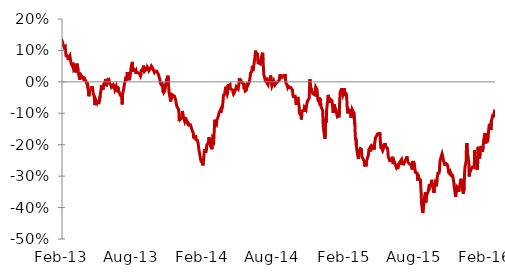
| Category | Series 0 |
|---|---|
| 2010-01-04 | 0.467 |
| 2010-01-05 | 0.465 |
| 2010-01-06 | 0.443 |
| 2010-01-07 | 0.453 |
| 2010-01-08 | 0.454 |
| 2010-01-12 | 0.45 |
| 2010-01-13 | 0.459 |
| 2010-01-14 | 0.483 |
| 2010-01-15 | 0.493 |
| 2010-01-18 | 0.49 |
| 2010-01-19 | 0.49 |
| 2010-01-20 | 0.501 |
| 2010-01-21 | 0.487 |
| 2010-01-22 | 0.493 |
| 2010-01-25 | 0.478 |
| 2010-01-26 | 0.474 |
| 2010-01-27 | 0.467 |
| 2010-01-28 | 0.447 |
| 2010-01-29 | 0.458 |
| 2010-02-01 | 0.446 |
| 2010-02-02 | 0.459 |
| 2010-02-03 | 0.451 |
| 2010-02-04 | 0.427 |
| 2010-02-05 | 0.419 |
| 2010-02-08 | 0.406 |
| 2010-02-09 | 0.417 |
| 2010-02-10 | 0.431 |
| 2010-02-11 | 0.441 |
| 2010-02-12 | 0.449 |
| 2010-02-15 | 0.434 |
| 2010-02-16 | 0.444 |
| 2010-02-17 | 0.466 |
| 2010-02-18 | 0.472 |
| 2010-02-19 | 0.48 |
| 2010-02-22 | 0.498 |
| 2010-02-23 | 0.507 |
| 2010-02-24 | 0.528 |
| 2010-02-25 | 0.509 |
| 2010-02-26 | 0.498 |
| 2010-03-01 | 0.491 |
| 2010-03-02 | 0.514 |
| 2010-03-03 | 0.516 |
| 2010-03-04 | 0.501 |
| 2010-03-05 | 0.515 |
| 2010-03-08 | 0.518 |
| 2010-03-09 | 0.516 |
| 2010-03-10 | 0.502 |
| 2010-03-11 | 0.51 |
| 2010-03-12 | 0.504 |
| 2010-03-15 | 0.498 |
| 2010-03-16 | 0.495 |
| 2010-03-17 | 0.51 |
| 2010-03-18 | 0.509 |
| 2010-03-19 | 0.486 |
| 2010-03-23 | 0.5 |
| 2010-03-24 | 0.484 |
| 2010-03-25 | 0.488 |
| 2010-03-26 | 0.487 |
| 2010-03-29 | 0.493 |
| 2010-03-30 | 0.507 |
| 2010-03-31 | 0.499 |
| 2010-04-05 | 0.502 |
| 2010-04-06 | 0.494 |
| 2010-04-07 | 0.506 |
| 2010-04-08 | 0.508 |
| 2010-04-09 | 0.504 |
| 2010-04-12 | 0.51 |
| 2010-04-13 | 0.514 |
| 2010-04-14 | 0.514 |
| 2010-04-15 | 0.511 |
| 2010-04-16 | 0.498 |
| 2010-04-19 | 0.496 |
| 2010-04-20 | 0.513 |
| 2010-04-21 | 0.516 |
| 2010-04-22 | 0.517 |
| 2010-04-23 | 0.513 |
| 2010-04-26 | 0.484 |
| 2010-04-27 | 0.478 |
| 2010-04-28 | 0.462 |
| 2010-04-29 | 0.453 |
| 2010-04-30 | 0.454 |
| 2010-05-03 | 0.452 |
| 2010-05-04 | 0.441 |
| 2010-05-05 | 0.409 |
| 2010-05-06 | 0.366 |
| 2010-05-07 | 0.341 |
| 2010-05-10 | 0.367 |
| 2010-05-11 | 0.363 |
| 2010-05-12 | 0.383 |
| 2010-05-13 | 0.374 |
| 2010-05-14 | 0.366 |
| 2010-05-18 | 0.342 |
| 2010-05-19 | 0.319 |
| 2010-05-20 | 0.309 |
| 2010-05-21 | 0.327 |
| 2010-05-24 | 0.336 |
| 2010-05-25 | 0.32 |
| 2010-05-26 | 0.347 |
| 2010-05-27 | 0.333 |
| 2010-05-28 | 0.338 |
| 2010-05-31 | 0.315 |
| 2010-06-01 | 0.321 |
| 2010-06-02 | 0.331 |
| 2010-06-03 | 0.323 |
| 2010-06-04 | 0.312 |
| 2010-06-08 | 0.312 |
| 2010-06-09 | 0.318 |
| 2010-06-10 | 0.314 |
| 2010-06-11 | 0.298 |
| 2010-06-15 | 0.298 |
| 2010-06-16 | 0.315 |
| 2010-06-17 | 0.309 |
| 2010-06-18 | 0.311 |
| 2010-06-21 | 0.296 |
| 2010-06-22 | 0.298 |
| 2010-06-23 | 0.3 |
| 2010-06-24 | 0.29 |
| 2010-06-25 | 0.298 |
| 2010-06-28 | 0.289 |
| 2010-06-29 | 0.261 |
| 2010-06-30 | 0.27 |
| 2010-07-01 | 0.267 |
| 2010-07-02 | 0.27 |
| 2010-07-06 | 0.273 |
| 2010-07-07 | 0.281 |
| 2010-07-08 | 0.306 |
| 2010-07-09 | 0.311 |
| 2010-07-12 | 0.324 |
| 2010-07-13 | 0.325 |
| 2010-07-14 | 0.333 |
| 2010-07-15 | 0.338 |
| 2010-07-16 | 0.323 |
| 2010-07-19 | 0.317 |
| 2010-07-21 | 0.335 |
| 2010-07-22 | 0.316 |
| 2010-07-23 | 0.314 |
| 2010-07-26 | 0.334 |
| 2010-07-27 | 0.352 |
| 2010-07-28 | 0.349 |
| 2010-07-29 | 0.308 |
| 2010-07-30 | 0.307 |
| 2010-08-02 | 0.301 |
| 2010-08-03 | 0.306 |
| 2010-08-04 | 0.316 |
| 2010-08-05 | 0.314 |
| 2010-08-06 | 0.297 |
| 2010-08-09 | 0.308 |
| 2010-08-10 | 0.298 |
| 2010-08-11 | 0.278 |
| 2010-08-12 | 0.277 |
| 2010-08-13 | 0.287 |
| 2010-08-17 | 0.288 |
| 2010-08-18 | 0.282 |
| 2010-08-19 | 0.277 |
| 2010-08-20 | 0.254 |
| 2010-08-23 | 0.27 |
| 2010-08-24 | 0.276 |
| 2010-08-25 | 0.281 |
| 2010-08-26 | 0.286 |
| 2010-08-27 | 0.305 |
| 2010-08-30 | 0.332 |
| 2010-08-31 | 0.341 |
| 2010-09-01 | 0.379 |
| 2010-09-02 | 0.343 |
| 2010-09-03 | 0.341 |
| 2010-09-06 | 0.344 |
| 2010-09-07 | 0.341 |
| 2010-09-08 | 0.354 |
| 2010-09-09 | 0.352 |
| 2010-09-10 | 0.338 |
| 2010-09-13 | 0.309 |
| 2010-09-14 | 0.31 |
| 2010-09-15 | 0.307 |
| 2010-09-16 | 0.287 |
| 2010-09-17 | 0.289 |
| 2010-09-20 | 0.292 |
| 2010-09-21 | 0.287 |
| 2010-09-22 | 0.28 |
| 2010-09-23 | 0.26 |
| 2010-09-24 | 0.242 |
| 2010-09-27 | 0.259 |
| 2010-09-28 | 0.272 |
| 2010-09-29 | 0.295 |
| 2010-09-30 | 0.294 |
| 2010-10-01 | 0.28 |
| 2010-10-04 | 0.264 |
| 2010-10-05 | 0.281 |
| 2010-10-06 | 0.304 |
| 2010-10-07 | 0.305 |
| 2010-10-08 | 0.338 |
| 2010-10-11 | 0.355 |
| 2010-10-12 | 0.353 |
| 2010-10-13 | 0.364 |
| 2010-10-14 | 0.332 |
| 2010-10-15 | 0.332 |
| 2010-10-19 | 0.344 |
| 2010-10-20 | 0.352 |
| 2010-10-21 | 0.365 |
| 2010-10-22 | 0.392 |
| 2010-10-25 | 0.397 |
| 2010-10-26 | 0.38 |
| 2010-10-27 | 0.367 |
| 2010-10-28 | 0.398 |
| 2010-10-29 | 0.427 |
| 2010-11-02 | 0.416 |
| 2010-11-03 | 0.407 |
| 2010-11-04 | 0.417 |
| 2010-11-05 | 0.398 |
| 2010-11-08 | 0.397 |
| 2010-11-09 | 0.397 |
| 2010-11-10 | 0.368 |
| 2010-11-11 | 0.34 |
| 2010-11-12 | 0.311 |
| 2010-11-16 | 0.286 |
| 2010-11-17 | 0.317 |
| 2010-11-18 | 0.332 |
| 2010-11-19 | 0.309 |
| 2010-11-22 | 0.302 |
| 2010-11-23 | 0.277 |
| 2010-11-24 | 0.308 |
| 2010-11-25 | 0.295 |
| 2010-11-26 | 0.295 |
| 2010-11-29 | 0.277 |
| 2010-11-30 | 0.286 |
| 2010-12-01 | 0.279 |
| 2010-12-02 | 0.299 |
| 2010-12-03 | 0.298 |
| 2010-12-06 | 0.304 |
| 2010-12-07 | 0.307 |
| 2010-12-09 | 0.29 |
| 2010-12-10 | 0.293 |
| 2010-12-13 | 0.297 |
| 2010-12-14 | 0.291 |
| 2010-12-15 | 0.277 |
| 2010-12-16 | 0.287 |
| 2010-12-17 | 0.286 |
| 2010-12-20 | 0.285 |
| 2010-12-21 | 0.291 |
| 2010-12-22 | 0.293 |
| 2010-12-23 | 0.302 |
| 2010-12-24 | 0.305 |
| 2010-12-27 | 0.311 |
| 2010-12-28 | 0.297 |
| 2010-12-29 | 0.288 |
| 2010-12-30 | 0.283 |
| 2011-01-03 | 0.275 |
| 2011-01-04 | 0.275 |
| 2011-01-05 | 0.268 |
| 2011-01-06 | 0.247 |
| 2011-01-07 | 0.25 |
| 2011-01-11 | 0.243 |
| 2011-01-12 | 0.255 |
| 2011-01-13 | 0.262 |
| 2011-01-14 | 0.262 |
| 2011-01-17 | 0.285 |
| 2011-01-18 | 0.273 |
| 2011-01-19 | 0.272 |
| 2011-01-20 | 0.249 |
| 2011-01-21 | 0.259 |
| 2011-01-24 | 0.263 |
| 2011-01-25 | 0.252 |
| 2011-01-26 | 0.265 |
| 2011-01-27 | 0.262 |
| 2011-01-28 | 0.263 |
| 2011-01-31 | 0.278 |
| 2011-02-01 | 0.283 |
| 2011-02-02 | 0.274 |
| 2011-02-03 | 0.255 |
| 2011-02-04 | 0.233 |
| 2011-02-07 | 0.22 |
| 2011-02-08 | 0.232 |
| 2011-02-09 | 0.223 |
| 2011-02-10 | 0.213 |
| 2011-02-11 | 0.215 |
| 2011-02-14 | 0.225 |
| 2011-02-15 | 0.21 |
| 2011-02-16 | 0.208 |
| 2011-02-17 | 0.189 |
| 2011-02-18 | 0.162 |
| 2011-02-21 | 0.179 |
| 2011-02-22 | 0.178 |
| 2011-02-23 | 0.198 |
| 2011-02-24 | 0.2 |
| 2011-02-25 | 0.201 |
| 2011-02-28 | 0.225 |
| 2011-03-01 | 0.23 |
| 2011-03-02 | 0.223 |
| 2011-03-03 | 0.239 |
| 2011-03-04 | 0.242 |
| 2011-03-07 | 0.236 |
| 2011-03-08 | 0.223 |
| 2011-03-09 | 0.229 |
| 2011-03-10 | 0.202 |
| 2011-03-11 | 0.173 |
| 2011-03-14 | 0.163 |
| 2011-03-15 | 0.152 |
| 2011-03-16 | 0.138 |
| 2011-03-17 | 0.183 |
| 2011-03-18 | 0.198 |
| 2011-03-22 | 0.202 |
| 2011-03-23 | 0.198 |
| 2011-03-24 | 0.197 |
| 2011-03-25 | 0.182 |
| 2011-03-28 | 0.171 |
| 2011-03-29 | 0.157 |
| 2011-03-30 | 0.146 |
| 2011-03-31 | 0.154 |
| 2011-04-01 | 0.151 |
| 2011-04-04 | 0.15 |
| 2011-04-05 | 0.158 |
| 2011-04-06 | 0.151 |
| 2011-04-07 | 0.152 |
| 2011-04-08 | 0.155 |
| 2011-04-11 | 0.159 |
| 2011-04-12 | 0.133 |
| 2011-04-13 | 0.132 |
| 2011-04-14 | 0.122 |
| 2011-04-15 | 0.115 |
| 2011-04-18 | 0.108 |
| 2011-04-19 | 0.121 |
| 2011-04-20 | 0.149 |
| 2011-04-25 | 0.139 |
| 2011-04-26 | 0.146 |
| 2011-04-27 | 0.126 |
| 2011-04-28 | 0.136 |
| 2011-04-29 | 0.162 |
| 2011-05-02 | 0.187 |
| 2011-05-03 | 0.168 |
| 2011-05-04 | 0.153 |
| 2011-05-05 | 0.13 |
| 2011-05-06 | 0.13 |
| 2011-05-09 | 0.138 |
| 2011-05-10 | 0.159 |
| 2011-05-11 | 0.175 |
| 2011-05-12 | 0.191 |
| 2011-05-13 | 0.201 |
| 2011-05-16 | 0.196 |
| 2011-05-17 | 0.194 |
| 2011-05-18 | 0.201 |
| 2011-05-19 | 0.175 |
| 2011-05-20 | 0.18 |
| 2011-05-23 | 0.167 |
| 2011-05-24 | 0.175 |
| 2011-05-25 | 0.171 |
| 2011-05-26 | 0.177 |
| 2011-05-27 | 0.175 |
| 2011-05-30 | 0.189 |
| 2011-05-31 | 0.206 |
| 2011-06-01 | 0.193 |
| 2011-06-02 | 0.192 |
| 2011-06-03 | 0.191 |
| 2011-06-07 | 0.188 |
| 2011-06-08 | 0.184 |
| 2011-06-09 | 0.183 |
| 2011-06-10 | 0.174 |
| 2011-06-13 | 0.165 |
| 2011-06-14 | 0.164 |
| 2011-06-15 | 0.145 |
| 2011-06-16 | 0.147 |
| 2011-06-17 | 0.143 |
| 2011-06-20 | 0.142 |
| 2011-06-21 | 0.162 |
| 2011-06-22 | 0.16 |
| 2011-06-23 | 0.16 |
| 2011-06-24 | 0.162 |
| 2011-06-28 | 0.156 |
| 2011-06-29 | 0.162 |
| 2011-06-30 | 0.143 |
| 2011-07-01 | 0.144 |
| 2011-07-05 | 0.137 |
| 2011-07-06 | 0.107 |
| 2011-07-07 | 0.096 |
| 2011-07-08 | 0.078 |
| 2011-07-11 | 0.055 |
| 2011-07-12 | 0.044 |
| 2011-07-13 | 0.029 |
| 2011-07-14 | 0.012 |
| 2011-07-15 | 0.009 |
| 2011-07-18 | -0.005 |
| 2011-07-19 | 0.016 |
| 2011-07-21 | 0.035 |
| 2011-07-22 | 0.052 |
| 2011-07-25 | 0.052 |
| 2011-07-26 | 0.055 |
| 2011-07-27 | 0.041 |
| 2011-07-28 | 0.046 |
| 2011-07-29 | 0.036 |
| 2011-08-01 | 0.055 |
| 2011-08-02 | 0.047 |
| 2011-08-03 | 0.046 |
| 2011-08-04 | 0.027 |
| 2011-08-05 | 0.02 |
| 2011-08-08 | -0.021 |
| 2011-08-09 | 0.002 |
| 2011-08-10 | 0 |
| 2011-08-11 | 0.009 |
| 2011-08-12 | 0.016 |
| 2011-08-16 | 0.009 |
| 2011-08-17 | 0.011 |
| 2011-08-18 | -0.014 |
| 2011-08-19 | -0.027 |
| 2011-08-22 | -0.04 |
| 2011-08-23 | -0.023 |
| 2011-08-24 | -0.033 |
| 2011-08-25 | -0.07 |
| 2011-08-26 | -0.047 |
| 2011-08-29 | -0.032 |
| 2011-08-30 | -0.047 |
| 2011-08-31 | -0.043 |
| 2011-09-01 | -0.055 |
| 2011-09-02 | -0.052 |
| 2011-09-05 | -0.054 |
| 2011-09-06 | -0.037 |
| 2011-09-07 | -0.034 |
| 2011-09-08 | -0.029 |
| 2011-09-09 | -0.036 |
| 2011-09-12 | -0.037 |
| 2011-09-13 | -0.045 |
| 2011-09-14 | -0.045 |
| 2011-09-15 | -0.029 |
| 2011-09-16 | -0.005 |
| 2011-09-19 | -0.01 |
| 2011-09-20 | -0.021 |
| 2011-09-21 | -0.052 |
| 2011-09-22 | -0.094 |
| 2011-09-23 | -0.105 |
| 2011-09-26 | -0.109 |
| 2011-09-27 | -0.103 |
| 2011-09-28 | -0.123 |
| 2011-09-29 | -0.13 |
| 2011-09-30 | -0.132 |
| 2011-10-03 | -0.163 |
| 2011-10-04 | -0.163 |
| 2011-10-05 | -0.155 |
| 2011-10-06 | -0.164 |
| 2011-10-07 | -0.158 |
| 2011-10-10 | -0.135 |
| 2011-10-11 | -0.151 |
| 2011-10-12 | -0.144 |
| 2011-10-13 | -0.153 |
| 2011-10-14 | -0.164 |
| 2011-10-18 | -0.155 |
| 2011-10-19 | -0.147 |
| 2011-10-20 | -0.14 |
| 2011-10-21 | -0.14 |
| 2011-10-24 | -0.152 |
| 2011-10-25 | -0.166 |
| 2011-10-26 | -0.17 |
| 2011-10-27 | -0.169 |
| 2011-10-28 | -0.17 |
| 2011-10-31 | -0.179 |
| 2011-11-01 | -0.194 |
| 2011-11-02 | -0.169 |
| 2011-11-03 | -0.135 |
| 2011-11-04 | -0.115 |
| 2011-11-08 | -0.073 |
| 2011-11-09 | -0.122 |
| 2011-11-10 | -0.142 |
| 2011-11-11 | -0.117 |
| 2011-11-15 | -0.117 |
| 2011-11-16 | -0.107 |
| 2011-11-17 | -0.131 |
| 2011-11-18 | -0.133 |
| 2011-11-21 | -0.136 |
| 2011-11-22 | -0.137 |
| 2011-11-23 | -0.173 |
| 2011-11-24 | -0.184 |
| 2011-11-25 | -0.208 |
| 2011-11-28 | -0.19 |
| 2011-11-29 | -0.188 |
| 2011-11-30 | -0.163 |
| 2011-12-01 | -0.148 |
| 2011-12-02 | -0.143 |
| 2011-12-05 | -0.156 |
| 2011-12-06 | -0.178 |
| 2011-12-07 | -0.146 |
| 2011-12-09 | -0.146 |
| 2011-12-12 | -0.148 |
| 2011-12-13 | -0.147 |
| 2011-12-14 | -0.167 |
| 2011-12-15 | -0.177 |
| 2011-12-16 | -0.161 |
| 2011-12-19 | -0.172 |
| 2011-12-20 | -0.167 |
| 2011-12-21 | -0.153 |
| 2011-12-22 | -0.135 |
| 2011-12-23 | -0.131 |
| 2011-12-26 | -0.124 |
| 2011-12-27 | -0.133 |
| 2011-12-28 | -0.119 |
| 2011-12-29 | -0.117 |
| 2012-01-02 | -0.122 |
| 2012-01-03 | -0.096 |
| 2012-01-04 | -0.105 |
| 2012-01-05 | -0.115 |
| 2012-01-06 | -0.116 |
| 2012-01-10 | -0.107 |
| 2012-01-11 | -0.106 |
| 2012-01-12 | -0.108 |
| 2012-01-13 | -0.089 |
| 2012-01-16 | -0.107 |
| 2012-01-17 | -0.097 |
| 2012-01-18 | -0.084 |
| 2012-01-19 | -0.098 |
| 2012-01-20 | -0.098 |
| 2012-01-23 | -0.094 |
| 2012-01-24 | -0.093 |
| 2012-01-25 | -0.093 |
| 2012-01-26 | -0.086 |
| 2012-01-27 | -0.084 |
| 2012-01-30 | -0.057 |
| 2012-01-31 | -0.035 |
| 2012-02-01 | -0.046 |
| 2012-02-02 | -0.032 |
| 2012-02-03 | -0.027 |
| 2012-02-06 | -0.031 |
| 2012-02-07 | -0.032 |
| 2012-02-08 | -0.022 |
| 2012-02-09 | -0.019 |
| 2012-02-10 | -0.006 |
| 2012-02-13 | 0.015 |
| 2012-02-14 | 0.01 |
| 2012-02-15 | 0.009 |
| 2012-02-16 | 0.004 |
| 2012-02-17 | 0.007 |
| 2012-02-20 | 0.001 |
| 2012-02-21 | -0.029 |
| 2012-02-22 | -0.034 |
| 2012-02-23 | -0.023 |
| 2012-02-24 | -0.036 |
| 2012-02-27 | -0.047 |
| 2012-02-28 | -0.046 |
| 2012-02-29 | -0.016 |
| 2012-03-01 | -0.014 |
| 2012-03-02 | 0.007 |
| 2012-03-05 | 0.021 |
| 2012-03-06 | 0.013 |
| 2012-03-07 | 0.04 |
| 2012-03-08 | 0.051 |
| 2012-03-09 | 0.009 |
| 2012-03-12 | -0.012 |
| 2012-03-13 | 0.004 |
| 2012-03-14 | -0.001 |
| 2012-03-15 | -0.002 |
| 2012-03-16 | -0.013 |
| 2012-03-20 | -0.005 |
| 2012-03-21 | 0.003 |
| 2012-03-22 | 0.001 |
| 2012-03-23 | 0.008 |
| 2012-03-26 | 0.023 |
| 2012-03-27 | 0.016 |
| 2012-03-28 | 0.009 |
| 2012-03-29 | 0.018 |
| 2012-03-30 | 0.011 |
| 2012-04-02 | 0.019 |
| 2012-04-03 | 0.023 |
| 2012-04-04 | 0.039 |
| 2012-04-09 | 0.036 |
| 2012-04-10 | 0.041 |
| 2012-04-11 | 0.05 |
| 2012-04-12 | 0.06 |
| 2012-04-13 | 0.051 |
| 2012-04-16 | 0.04 |
| 2012-04-17 | 0.044 |
| 2012-04-18 | 0.038 |
| 2012-04-19 | 0.035 |
| 2012-04-20 | 0.033 |
| 2012-04-23 | 0.026 |
| 2012-04-24 | 0.026 |
| 2012-04-25 | 0.045 |
| 2012-04-26 | 0.049 |
| 2012-04-27 | 0.074 |
| 2012-04-30 | 0.077 |
| 2012-05-02 | 0.083 |
| 2012-05-03 | 0.068 |
| 2012-05-04 | 0.058 |
| 2012-05-07 | 0.057 |
| 2012-05-08 | 0.051 |
| 2012-05-09 | 0.054 |
| 2012-05-10 | 0.038 |
| 2012-05-11 | 0.037 |
| 2012-05-14 | 0.02 |
| 2012-05-15 | 0.013 |
| 2012-05-16 | 0.016 |
| 2012-05-17 | -0.008 |
| 2012-05-18 | -0.001 |
| 2012-05-22 | 0 |
| 2012-05-23 | -0.003 |
| 2012-05-24 | -0.01 |
| 2012-05-25 | -0.027 |
| 2012-05-28 | -0.03 |
| 2012-05-29 | -0.024 |
| 2012-05-30 | -0.035 |
| 2012-05-31 | -0.014 |
| 2012-06-01 | -0.044 |
| 2012-06-04 | -0.052 |
| 2012-06-05 | -0.053 |
| 2012-06-06 | -0.033 |
| 2012-06-07 | -0.031 |
| 2012-06-08 | -0.017 |
| 2012-06-12 | -0.027 |
| 2012-06-13 | -0.029 |
| 2012-06-14 | -0.019 |
| 2012-06-15 | -0.036 |
| 2012-06-19 | -0.027 |
| 2012-06-20 | -0.016 |
| 2012-06-21 | -0.043 |
| 2012-06-22 | -0.047 |
| 2012-06-25 | -0.075 |
| 2012-06-26 | -0.064 |
| 2012-06-27 | -0.048 |
| 2012-06-28 | -0.063 |
| 2012-06-29 | -0.023 |
| 2012-07-03 | -0.002 |
| 2012-07-04 | 0.006 |
| 2012-07-05 | 0.037 |
| 2012-07-06 | 0.043 |
| 2012-07-09 | 0.03 |
| 2012-07-10 | 0.043 |
| 2012-07-11 | 0.05 |
| 2012-07-12 | 0.034 |
| 2012-07-13 | 0.018 |
| 2012-07-16 | 0.005 |
| 2012-07-17 | 0.009 |
| 2012-07-18 | 0.006 |
| 2012-07-19 | 0.004 |
| 2012-07-23 | 0.003 |
| 2012-07-24 | -0.008 |
| 2012-07-25 | -0.01 |
| 2012-07-26 | -0.012 |
| 2012-07-27 | 0.016 |
| 2012-07-30 | 0.019 |
| 2012-07-31 | 0.044 |
| 2012-08-01 | 0.049 |
| 2012-08-02 | 0.073 |
| 2012-08-03 | 0.041 |
| 2012-08-06 | 0.035 |
| 2012-08-08 | 0.008 |
| 2012-08-09 | 0.025 |
| 2012-08-10 | 0.025 |
| 2012-08-13 | 0.02 |
| 2012-08-14 | 0.053 |
| 2012-08-15 | 0.065 |
| 2012-08-16 | 0.066 |
| 2012-08-17 | 0.049 |
| 2012-08-21 | 0.039 |
| 2012-08-22 | 0.049 |
| 2012-08-23 | 0.046 |
| 2012-08-24 | 0.024 |
| 2012-08-27 | 0.021 |
| 2012-08-28 | 0.024 |
| 2012-08-29 | 0.019 |
| 2012-08-30 | 0.015 |
| 2012-08-31 | 0.035 |
| 2012-09-03 | 0.02 |
| 2012-09-04 | 0.005 |
| 2012-09-05 | 0.003 |
| 2012-09-06 | 0.03 |
| 2012-09-07 | 0.036 |
| 2012-09-10 | 0.029 |
| 2012-09-11 | 0.027 |
| 2012-09-12 | 0.014 |
| 2012-09-13 | 0.007 |
| 2012-09-14 | 0.017 |
| 2012-09-17 | 0.003 |
| 2012-09-18 | 0.019 |
| 2012-09-19 | 0.059 |
| 2012-09-20 | 0.067 |
| 2012-09-21 | 0.076 |
| 2012-09-24 | 0.062 |
| 2012-09-25 | 0.061 |
| 2012-09-26 | 0.049 |
| 2012-09-27 | 0.068 |
| 2012-09-28 | 0.081 |
| 2012-10-01 | 0.071 |
| 2012-10-02 | 0.071 |
| 2012-10-03 | 0.063 |
| 2012-10-04 | 0.073 |
| 2012-10-05 | 0.062 |
| 2012-10-08 | 0.064 |
| 2012-10-09 | 0.051 |
| 2012-10-10 | 0.052 |
| 2012-10-11 | 0.049 |
| 2012-10-12 | 0.047 |
| 2012-10-16 | 0.064 |
| 2012-10-17 | 0.08 |
| 2012-10-18 | 0.087 |
| 2012-10-19 | 0.085 |
| 2012-10-22 | 0.102 |
| 2012-10-23 | 0.098 |
| 2012-10-24 | 0.091 |
| 2012-10-25 | 0.113 |
| 2012-10-26 | 0.121 |
| 2012-10-29 | 0.139 |
| 2012-10-30 | 0.128 |
| 2012-10-31 | 0.117 |
| 2012-11-01 | 0.102 |
| 2012-11-02 | 0.088 |
| 2012-11-06 | 0.097 |
| 2012-11-07 | 0.078 |
| 2012-11-08 | 0.098 |
| 2012-11-09 | 0.102 |
| 2012-11-13 | 0.103 |
| 2012-11-14 | 0.097 |
| 2012-11-15 | 0.108 |
| 2012-11-16 | 0.118 |
| 2012-11-19 | 0.126 |
| 2012-11-20 | 0.153 |
| 2012-11-21 | 0.158 |
| 2012-11-22 | 0.164 |
| 2012-11-23 | 0.142 |
| 2012-11-26 | 0.129 |
| 2012-11-27 | 0.104 |
| 2012-11-28 | 0.098 |
| 2012-11-29 | 0.096 |
| 2012-11-30 | 0.111 |
| 2012-12-03 | 0.135 |
| 2012-12-04 | 0.118 |
| 2012-12-05 | 0.128 |
| 2012-12-06 | 0.134 |
| 2012-12-07 | 0.138 |
| 2012-12-10 | 0.155 |
| 2012-12-11 | 0.163 |
| 2012-12-12 | 0.146 |
| 2012-12-13 | 0.149 |
| 2012-12-14 | 0.134 |
| 2012-12-17 | 0.131 |
| 2012-12-18 | 0.123 |
| 2012-12-19 | 0.13 |
| 2012-12-20 | 0.131 |
| 2012-12-21 | 0.135 |
| 2012-12-24 | 0.138 |
| 2012-12-26 | 0.148 |
| 2012-12-27 | 0.151 |
| 2012-12-28 | 0.135 |
| 2013-01-02 | 0.127 |
| 2013-01-03 | 0.137 |
| 2013-01-04 | 0.145 |
| 2013-01-08 | 0.124 |
| 2013-01-09 | 0.136 |
| 2013-01-10 | 0.147 |
| 2013-01-11 | 0.143 |
| 2013-01-14 | 0.154 |
| 2013-01-15 | 0.14 |
| 2013-01-16 | 0.132 |
| 2013-01-17 | 0.132 |
| 2013-01-18 | 0.138 |
| 2013-01-21 | 0.136 |
| 2013-01-22 | 0.143 |
| 2013-01-23 | 0.147 |
| 2013-01-24 | 0.152 |
| 2013-01-25 | 0.157 |
| 2013-01-28 | 0.142 |
| 2013-01-29 | 0.134 |
| 2013-01-30 | 0.135 |
| 2013-01-31 | 0.128 |
| 2013-02-01 | 0.134 |
| 2013-02-04 | 0.133 |
| 2013-02-05 | 0.136 |
| 2013-02-06 | 0.127 |
| 2013-02-07 | 0.12 |
| 2013-02-08 | 0.121 |
| 2013-02-11 | 0.107 |
| 2013-02-12 | 0.105 |
| 2013-02-13 | 0.111 |
| 2013-02-14 | 0.094 |
| 2013-02-15 | 0.083 |
| 2013-02-18 | 0.083 |
| 2013-02-19 | 0.084 |
| 2013-02-20 | 0.08 |
| 2013-02-21 | 0.069 |
| 2013-02-22 | 0.075 |
| 2013-02-25 | 0.082 |
| 2013-02-26 | 0.083 |
| 2013-02-27 | 0.066 |
| 2013-02-28 | 0.058 |
| 2013-03-01 | 0.056 |
| 2013-03-04 | 0.049 |
| 2013-03-05 | 0.061 |
| 2013-03-06 | 0.054 |
| 2013-03-07 | 0.038 |
| 2013-03-08 | 0.038 |
| 2013-03-11 | 0.043 |
| 2013-03-12 | 0.03 |
| 2013-03-13 | 0.028 |
| 2013-03-14 | 0.029 |
| 2013-03-15 | 0.058 |
| 2013-03-18 | 0.038 |
| 2013-03-19 | 0.026 |
| 2013-03-20 | 0.031 |
| 2013-03-21 | 0.015 |
| 2013-03-22 | 0.007 |
| 2013-03-26 | 0.021 |
| 2013-03-27 | 0.021 |
| 2013-04-01 | 0.011 |
| 2013-04-02 | 0.015 |
| 2013-04-03 | 0.003 |
| 2013-04-04 | 0.009 |
| 2013-04-05 | 0.009 |
| 2013-04-08 | 0.001 |
| 2013-04-09 | 0 |
| 2013-04-10 | -0.008 |
| 2013-04-11 | -0.003 |
| 2013-04-12 | -0.008 |
| 2013-04-15 | -0.046 |
| 2013-04-16 | -0.035 |
| 2013-04-17 | -0.036 |
| 2013-04-18 | -0.027 |
| 2013-04-19 | -0.028 |
| 2013-04-22 | -0.019 |
| 2013-04-23 | -0.014 |
| 2013-04-24 | -0.019 |
| 2013-04-25 | -0.025 |
| 2013-04-26 | -0.037 |
| 2013-04-29 | -0.049 |
| 2013-04-30 | -0.074 |
| 2013-05-02 | -0.066 |
| 2013-05-03 | -0.058 |
| 2013-05-06 | -0.066 |
| 2013-05-07 | -0.062 |
| 2013-05-08 | -0.069 |
| 2013-05-09 | -0.061 |
| 2013-05-10 | -0.071 |
| 2013-05-14 | -0.045 |
| 2013-05-15 | -0.033 |
| 2013-05-16 | -0.03 |
| 2013-05-17 | -0.01 |
| 2013-05-20 | -0.02 |
| 2013-05-21 | -0.025 |
| 2013-05-22 | -0.019 |
| 2013-05-23 | -0.012 |
| 2013-05-24 | -0.005 |
| 2013-05-27 | 0.002 |
| 2013-05-28 | 0.002 |
| 2013-05-29 | 0.009 |
| 2013-05-30 | -0.014 |
| 2013-05-31 | -0.008 |
| 2013-06-04 | 0.013 |
| 2013-06-05 | 0.013 |
| 2013-06-06 | 0.002 |
| 2013-06-07 | -0.002 |
| 2013-06-11 | -0.012 |
| 2013-06-12 | -0.016 |
| 2013-06-13 | -0.014 |
| 2013-06-14 | -0.017 |
| 2013-06-17 | -0.009 |
| 2013-06-18 | -0.012 |
| 2013-06-19 | -0.021 |
| 2013-06-20 | -0.015 |
| 2013-06-21 | -0.024 |
| 2013-06-24 | -0.015 |
| 2013-06-25 | -0.024 |
| 2013-06-26 | -0.033 |
| 2013-06-27 | -0.021 |
| 2013-06-28 | -0.015 |
| 2013-07-02 | -0.035 |
| 2013-07-03 | -0.036 |
| 2013-07-04 | -0.038 |
| 2013-07-05 | -0.043 |
| 2013-07-08 | -0.046 |
| 2013-07-09 | -0.049 |
| 2013-07-10 | -0.072 |
| 2013-07-11 | -0.037 |
| 2013-07-12 | -0.033 |
| 2013-07-15 | -0.012 |
| 2013-07-16 | -0.01 |
| 2013-07-17 | 0.001 |
| 2013-07-18 | 0.005 |
| 2013-07-19 | 0.016 |
| 2013-07-22 | 0.005 |
| 2013-07-23 | 0.031 |
| 2013-07-24 | 0.033 |
| 2013-07-25 | 0.01 |
| 2013-07-26 | 0.007 |
| 2013-07-29 | 0.009 |
| 2013-07-30 | 0.016 |
| 2013-07-31 | 0.017 |
| 2013-08-01 | 0.037 |
| 2013-08-02 | 0.05 |
| 2013-08-05 | 0.064 |
| 2013-08-06 | 0.04 |
| 2013-08-08 | 0.032 |
| 2013-08-09 | 0.038 |
| 2013-08-12 | 0.033 |
| 2013-08-13 | 0.034 |
| 2013-08-14 | 0.037 |
| 2013-08-15 | 0.026 |
| 2013-08-16 | 0.032 |
| 2013-08-20 | 0.028 |
| 2013-08-21 | 0.026 |
| 2013-08-22 | 0.029 |
| 2013-08-23 | 0.027 |
| 2013-08-26 | 0.018 |
| 2013-08-27 | 0.023 |
| 2013-08-28 | 0.039 |
| 2013-08-29 | 0.032 |
| 2013-08-30 | 0.037 |
| 2013-09-02 | 0.046 |
| 2013-09-03 | 0.052 |
| 2013-09-04 | 0.038 |
| 2013-09-05 | 0.033 |
| 2013-09-06 | 0.031 |
| 2013-09-09 | 0.039 |
| 2013-09-10 | 0.048 |
| 2013-09-11 | 0.043 |
| 2013-09-12 | 0.034 |
| 2013-09-13 | 0.046 |
| 2013-09-16 | 0.041 |
| 2013-09-17 | 0.036 |
| 2013-09-18 | 0.036 |
| 2013-09-19 | 0.033 |
| 2013-09-20 | 0.041 |
| 2013-09-23 | 0.051 |
| 2013-09-24 | 0.053 |
| 2013-09-25 | 0.047 |
| 2013-09-26 | 0.049 |
| 2013-09-27 | 0.049 |
| 2013-09-30 | 0.033 |
| 2013-10-01 | 0.038 |
| 2013-10-02 | 0.031 |
| 2013-10-03 | 0.029 |
| 2013-10-04 | 0.029 |
| 2013-10-07 | 0.033 |
| 2013-10-08 | 0.034 |
| 2013-10-09 | 0.029 |
| 2013-10-10 | 0.029 |
| 2013-10-11 | 0.024 |
| 2013-10-15 | 0.007 |
| 2013-10-16 | -0.003 |
| 2013-10-17 | -0.004 |
| 2013-10-18 | -0.008 |
| 2013-10-21 | -0.006 |
| 2013-10-22 | -0.012 |
| 2013-10-23 | -0.034 |
| 2013-10-24 | -0.031 |
| 2013-10-25 | -0.034 |
| 2013-10-28 | -0.028 |
| 2013-10-29 | -0.026 |
| 2013-10-30 | -0.007 |
| 2013-10-31 | -0.007 |
| 2013-11-01 | 0.006 |
| 2013-11-05 | 0.02 |
| 2013-11-06 | -0.005 |
| 2013-11-07 | -0.021 |
| 2013-11-08 | -0.038 |
| 2013-11-12 | -0.062 |
| 2013-11-13 | -0.046 |
| 2013-11-14 | -0.039 |
| 2013-11-15 | -0.042 |
| 2013-11-18 | -0.042 |
| 2013-11-19 | -0.048 |
| 2013-11-20 | -0.049 |
| 2013-11-21 | -0.049 |
| 2013-11-22 | -0.047 |
| 2013-11-25 | -0.058 |
| 2013-11-26 | -0.067 |
| 2013-11-27 | -0.074 |
| 2013-11-28 | -0.078 |
| 2013-11-29 | -0.081 |
| 2013-12-02 | -0.087 |
| 2013-12-03 | -0.097 |
| 2013-12-04 | -0.124 |
| 2013-12-05 | -0.111 |
| 2013-12-06 | -0.12 |
| 2013-12-09 | -0.117 |
| 2013-12-10 | -0.113 |
| 2013-12-11 | -0.105 |
| 2013-12-12 | -0.093 |
| 2013-12-13 | -0.099 |
| 2013-12-16 | -0.119 |
| 2013-12-17 | -0.12 |
| 2013-12-18 | -0.126 |
| 2013-12-19 | -0.121 |
| 2013-12-20 | -0.113 |
| 2013-12-23 | -0.129 |
| 2013-12-24 | -0.129 |
| 2013-12-26 | -0.134 |
| 2013-12-27 | -0.131 |
| 2013-12-30 | -0.137 |
| 2014-01-02 | -0.137 |
| 2014-01-03 | -0.135 |
| 2014-01-07 | -0.157 |
| 2014-01-08 | -0.16 |
| 2014-01-09 | -0.161 |
| 2014-01-10 | -0.177 |
| 2014-01-13 | -0.178 |
| 2014-01-14 | -0.177 |
| 2014-01-15 | -0.169 |
| 2014-01-16 | -0.184 |
| 2014-01-17 | -0.183 |
| 2014-01-20 | -0.186 |
| 2014-01-21 | -0.191 |
| 2014-01-22 | -0.19 |
| 2014-01-23 | -0.208 |
| 2014-01-24 | -0.219 |
| 2014-01-27 | -0.237 |
| 2014-01-28 | -0.247 |
| 2014-01-29 | -0.25 |
| 2014-01-30 | -0.256 |
| 2014-01-31 | -0.251 |
| 2014-02-03 | -0.266 |
| 2014-02-04 | -0.259 |
| 2014-02-05 | -0.244 |
| 2014-02-06 | -0.229 |
| 2014-02-07 | -0.215 |
| 2014-02-10 | -0.226 |
| 2014-02-11 | -0.224 |
| 2014-02-12 | -0.212 |
| 2014-02-13 | -0.201 |
| 2014-02-14 | -0.198 |
| 2014-02-17 | -0.193 |
| 2014-02-18 | -0.184 |
| 2014-02-19 | -0.176 |
| 2014-02-20 | -0.194 |
| 2014-02-21 | -0.198 |
| 2014-02-24 | -0.185 |
| 2014-02-25 | -0.208 |
| 2014-02-26 | -0.214 |
| 2014-02-27 | -0.207 |
| 2014-02-28 | -0.181 |
| 2014-03-03 | -0.188 |
| 2014-03-04 | -0.16 |
| 2014-03-05 | -0.136 |
| 2014-03-06 | -0.12 |
| 2014-03-07 | -0.132 |
| 2014-03-10 | -0.136 |
| 2014-03-11 | -0.121 |
| 2014-03-12 | -0.122 |
| 2014-03-13 | -0.123 |
| 2014-03-14 | -0.113 |
| 2014-03-17 | -0.097 |
| 2014-03-18 | -0.1 |
| 2014-03-19 | -0.097 |
| 2014-03-20 | -0.09 |
| 2014-03-21 | -0.098 |
| 2014-03-25 | -0.08 |
| 2014-03-26 | -0.073 |
| 2014-03-27 | -0.062 |
| 2014-03-28 | -0.043 |
| 2014-03-31 | -0.04 |
| 2014-04-01 | -0.039 |
| 2014-04-02 | -0.022 |
| 2014-04-03 | -0.015 |
| 2014-04-04 | -0.023 |
| 2014-04-07 | -0.039 |
| 2014-04-08 | -0.036 |
| 2014-04-09 | -0.008 |
| 2014-04-10 | -0.014 |
| 2014-04-11 | -0.014 |
| 2014-04-14 | -0.009 |
| 2014-04-15 | -0.022 |
| 2014-04-16 | -0.021 |
| 2014-04-21 | -0.026 |
| 2014-04-22 | -0.036 |
| 2014-04-23 | -0.039 |
| 2014-04-24 | -0.042 |
| 2014-04-25 | -0.035 |
| 2014-04-28 | -0.026 |
| 2014-04-29 | -0.025 |
| 2014-04-30 | -0.015 |
| 2014-05-02 | -0.016 |
| 2014-05-05 | -0.023 |
| 2014-05-06 | -0.013 |
| 2014-05-07 | -0.006 |
| 2014-05-08 | 0.012 |
| 2014-05-09 | 0.006 |
| 2014-05-12 | 0.005 |
| 2014-05-13 | 0.001 |
| 2014-05-14 | 0 |
| 2014-05-15 | -0.003 |
| 2014-05-16 | -0.003 |
| 2014-05-19 | -0.007 |
| 2014-05-20 | -0.022 |
| 2014-05-21 | -0.018 |
| 2014-05-22 | -0.024 |
| 2014-05-23 | -0.029 |
| 2014-05-26 | -0.026 |
| 2014-05-27 | -0.023 |
| 2014-05-28 | -0.003 |
| 2014-05-29 | -0.013 |
| 2014-05-30 | -0.014 |
| 2014-06-03 | 0.001 |
| 2014-06-04 | 0.001 |
| 2014-06-05 | 0.018 |
| 2014-06-06 | 0.029 |
| 2014-06-09 | 0.033 |
| 2014-06-10 | 0.046 |
| 2014-06-11 | 0.051 |
| 2014-06-12 | 0.035 |
| 2014-06-13 | 0.039 |
| 2014-06-16 | 0.068 |
| 2014-06-17 | 0.075 |
| 2014-06-18 | 0.092 |
| 2014-06-19 | 0.099 |
| 2014-06-20 | 0.091 |
| 2014-06-24 | 0.089 |
| 2014-06-25 | 0.061 |
| 2014-06-26 | 0.059 |
| 2014-06-27 | 0.06 |
| 2014-07-01 | 0.057 |
| 2014-07-02 | 0.064 |
| 2014-07-03 | 0.073 |
| 2014-07-04 | 0.078 |
| 2014-07-07 | 0.093 |
| 2014-07-08 | 0.068 |
| 2014-07-09 | 0.049 |
| 2014-07-10 | 0.024 |
| 2014-07-11 | 0.024 |
| 2014-07-14 | 0.004 |
| 2014-07-15 | 0 |
| 2014-07-16 | 0.001 |
| 2014-07-17 | 0.013 |
| 2014-07-18 | -0.003 |
| 2014-07-21 | -0.009 |
| 2014-07-22 | -0.002 |
| 2014-07-23 | 0.001 |
| 2014-07-24 | 0.002 |
| 2014-07-25 | 0.004 |
| 2014-07-28 | 0.02 |
| 2014-07-29 | 0.001 |
| 2014-07-30 | -0.007 |
| 2014-07-31 | -0.014 |
| 2014-08-01 | -0.016 |
| 2014-08-04 | -0.002 |
| 2014-08-05 | 0.002 |
| 2014-08-06 | -0.002 |
| 2014-08-08 | -0.01 |
| 2014-08-11 | -0.004 |
| 2014-08-12 | -0.006 |
| 2014-08-13 | -0.001 |
| 2014-08-14 | -0.001 |
| 2014-08-15 | 0 |
| 2014-08-19 | 0.006 |
| 2014-08-20 | 0.017 |
| 2014-08-21 | 0.024 |
| 2014-08-22 | 0.019 |
| 2014-08-25 | 0.009 |
| 2014-08-26 | 0.019 |
| 2014-08-27 | 0.02 |
| 2014-08-28 | 0.018 |
| 2014-08-29 | 0.019 |
| 2014-09-01 | 0.017 |
| 2014-09-02 | 0.017 |
| 2014-09-03 | 0.025 |
| 2014-09-04 | 0.009 |
| 2014-09-05 | -0.002 |
| 2014-09-08 | -0.011 |
| 2014-09-09 | -0.015 |
| 2014-09-10 | -0.01 |
| 2014-09-11 | -0.014 |
| 2014-09-12 | -0.018 |
| 2014-09-15 | -0.019 |
| 2014-09-16 | -0.022 |
| 2014-09-17 | -0.018 |
| 2014-09-18 | -0.018 |
| 2014-09-19 | -0.02 |
| 2014-09-22 | -0.026 |
| 2014-09-23 | -0.04 |
| 2014-09-24 | -0.046 |
| 2014-09-25 | -0.045 |
| 2014-09-26 | -0.047 |
| 2014-09-29 | -0.046 |
| 2014-09-30 | -0.052 |
| 2014-10-01 | -0.069 |
| 2014-10-02 | -0.074 |
| 2014-10-03 | -0.06 |
| 2014-10-06 | -0.048 |
| 2014-10-07 | -0.059 |
| 2014-10-08 | -0.07 |
| 2014-10-09 | -0.074 |
| 2014-10-10 | -0.1 |
| 2014-10-14 | -0.108 |
| 2014-10-15 | -0.12 |
| 2014-10-16 | -0.104 |
| 2014-10-17 | -0.092 |
| 2014-10-20 | -0.091 |
| 2014-10-21 | -0.088 |
| 2014-10-22 | -0.095 |
| 2014-10-23 | -0.082 |
| 2014-10-24 | -0.082 |
| 2014-10-27 | -0.089 |
| 2014-10-28 | -0.079 |
| 2014-10-29 | -0.082 |
| 2014-10-30 | -0.065 |
| 2014-10-31 | -0.06 |
| 2014-11-04 | -0.053 |
| 2014-11-05 | -0.027 |
| 2014-11-06 | 0.009 |
| 2014-11-07 | -0.015 |
| 2014-11-10 | -0.022 |
| 2014-11-11 | -0.031 |
| 2014-11-12 | -0.029 |
| 2014-11-13 | -0.037 |
| 2014-11-14 | -0.036 |
| 2014-11-18 | -0.041 |
| 2014-11-19 | -0.039 |
| 2014-11-20 | -0.028 |
| 2014-11-21 | -0.017 |
| 2014-11-24 | -0.024 |
| 2014-11-25 | -0.034 |
| 2014-11-26 | -0.049 |
| 2014-11-27 | -0.059 |
| 2014-11-28 | -0.064 |
| 2014-12-01 | -0.05 |
| 2014-12-02 | -0.073 |
| 2014-12-03 | -0.054 |
| 2014-12-04 | -0.076 |
| 2014-12-05 | -0.079 |
| 2014-12-09 | -0.091 |
| 2014-12-10 | -0.131 |
| 2014-12-11 | -0.149 |
| 2014-12-12 | -0.15 |
| 2014-12-15 | -0.181 |
| 2014-12-16 | -0.153 |
| 2014-12-17 | -0.118 |
| 2014-12-18 | -0.129 |
| 2014-12-19 | -0.092 |
| 2014-12-22 | -0.057 |
| 2014-12-23 | -0.042 |
| 2014-12-24 | -0.04 |
| 2014-12-26 | -0.057 |
| 2014-12-29 | -0.067 |
| 2014-12-30 | -0.057 |
| 2015-01-02 | -0.06 |
| 2015-01-05 | -0.099 |
| 2015-01-06 | -0.096 |
| 2015-01-07 | -0.081 |
| 2015-01-08 | -0.071 |
| 2015-01-09 | -0.078 |
| 2015-01-13 | -0.092 |
| 2015-01-14 | -0.101 |
| 2015-01-15 | -0.107 |
| 2015-01-16 | -0.111 |
| 2015-01-19 | -0.108 |
| 2015-01-20 | -0.113 |
| 2015-01-21 | -0.088 |
| 2015-01-22 | -0.057 |
| 2015-01-23 | -0.035 |
| 2015-01-26 | -0.024 |
| 2015-01-27 | -0.02 |
| 2015-01-28 | -0.032 |
| 2015-01-29 | -0.036 |
| 2015-01-30 | -0.042 |
| 2015-02-02 | -0.03 |
| 2015-02-03 | -0.02 |
| 2015-02-04 | -0.041 |
| 2015-02-05 | -0.044 |
| 2015-02-06 | -0.033 |
| 2015-02-09 | -0.05 |
| 2015-02-10 | -0.077 |
| 2015-02-11 | -0.096 |
| 2015-02-12 | -0.1 |
| 2015-02-13 | -0.087 |
| 2015-02-16 | -0.093 |
| 2015-02-17 | -0.101 |
| 2015-02-18 | -0.087 |
| 2015-02-19 | -0.092 |
| 2015-02-20 | -0.115 |
| 2015-02-23 | -0.087 |
| 2015-02-24 | -0.086 |
| 2015-02-25 | -0.093 |
| 2015-02-26 | -0.11 |
| 2015-02-27 | -0.095 |
| 2015-03-02 | -0.137 |
| 2015-03-03 | -0.171 |
| 2015-03-04 | -0.184 |
| 2015-03-05 | -0.181 |
| 2015-03-06 | -0.205 |
| 2015-03-09 | -0.232 |
| 2015-03-10 | -0.237 |
| 2015-03-11 | -0.246 |
| 2015-03-12 | -0.225 |
| 2015-03-13 | -0.22 |
| 2015-03-16 | -0.212 |
| 2015-03-17 | -0.213 |
| 2015-03-18 | -0.209 |
| 2015-03-19 | -0.215 |
| 2015-03-20 | -0.238 |
| 2015-03-24 | -0.248 |
| 2015-03-25 | -0.248 |
| 2015-03-26 | -0.253 |
| 2015-03-27 | -0.265 |
| 2015-03-30 | -0.266 |
| 2015-03-31 | -0.269 |
| 2015-04-01 | -0.253 |
| 2015-04-06 | -0.232 |
| 2015-04-07 | -0.216 |
| 2015-04-08 | -0.219 |
| 2015-04-09 | -0.212 |
| 2015-04-10 | -0.221 |
| 2015-04-13 | -0.211 |
| 2015-04-14 | -0.217 |
| 2015-04-15 | -0.203 |
| 2015-04-16 | -0.205 |
| 2015-04-17 | -0.202 |
| 2015-04-20 | -0.205 |
| 2015-04-21 | -0.215 |
| 2015-04-22 | -0.194 |
| 2015-04-23 | -0.19 |
| 2015-04-24 | -0.178 |
| 2015-04-27 | -0.172 |
| 2015-04-28 | -0.17 |
| 2015-04-29 | -0.166 |
| 2015-04-30 | -0.167 |
| 2015-05-04 | -0.165 |
| 2015-05-05 | -0.16 |
| 2015-05-06 | -0.171 |
| 2015-05-07 | -0.195 |
| 2015-05-08 | -0.21 |
| 2015-05-11 | -0.212 |
| 2015-05-12 | -0.216 |
| 2015-05-13 | -0.211 |
| 2015-05-14 | -0.214 |
| 2015-05-15 | -0.215 |
| 2015-05-19 | -0.195 |
| 2015-05-20 | -0.205 |
| 2015-05-21 | -0.205 |
| 2015-05-22 | -0.208 |
| 2015-05-25 | -0.211 |
| 2015-05-26 | -0.219 |
| 2015-05-27 | -0.237 |
| 2015-05-28 | -0.241 |
| 2015-05-29 | -0.239 |
| 2015-06-01 | -0.255 |
| 2015-06-02 | -0.247 |
| 2015-06-03 | -0.249 |
| 2015-06-04 | -0.248 |
| 2015-06-05 | -0.243 |
| 2015-06-09 | -0.262 |
| 2015-06-10 | -0.262 |
| 2015-06-11 | -0.251 |
| 2015-06-12 | -0.255 |
| 2015-06-16 | -0.269 |
| 2015-06-17 | -0.264 |
| 2015-06-18 | -0.262 |
| 2015-06-19 | -0.274 |
| 2015-06-22 | -0.273 |
| 2015-06-23 | -0.258 |
| 2015-06-24 | -0.256 |
| 2015-06-25 | -0.264 |
| 2015-06-26 | -0.255 |
| 2015-06-30 | -0.247 |
| 2015-07-01 | -0.26 |
| 2015-07-02 | -0.256 |
| 2015-07-03 | -0.261 |
| 2015-07-06 | -0.262 |
| 2015-07-07 | -0.261 |
| 2015-07-08 | -0.262 |
| 2015-07-09 | -0.253 |
| 2015-07-10 | -0.251 |
| 2015-07-13 | -0.242 |
| 2015-07-14 | -0.237 |
| 2015-07-15 | -0.242 |
| 2015-07-16 | -0.241 |
| 2015-07-17 | -0.255 |
| 2015-07-21 | -0.261 |
| 2015-07-22 | -0.262 |
| 2015-07-23 | -0.26 |
| 2015-07-24 | -0.262 |
| 2015-07-27 | -0.274 |
| 2015-07-28 | -0.279 |
| 2015-07-29 | -0.253 |
| 2015-07-30 | -0.258 |
| 2015-07-31 | -0.252 |
| 2015-08-03 | -0.265 |
| 2015-08-04 | -0.278 |
| 2015-08-05 | -0.291 |
| 2015-08-06 | -0.287 |
| 2015-08-10 | -0.291 |
| 2015-08-11 | -0.314 |
| 2015-08-12 | -0.295 |
| 2015-08-13 | -0.305 |
| 2015-08-14 | -0.306 |
| 2015-08-18 | -0.312 |
| 2015-08-19 | -0.334 |
| 2015-08-20 | -0.354 |
| 2015-08-21 | -0.386 |
| 2015-08-24 | -0.418 |
| 2015-08-25 | -0.42 |
| 2015-08-26 | -0.42 |
| 2015-08-27 | -0.386 |
| 2015-08-28 | -0.37 |
| 2015-08-31 | -0.351 |
| 2015-09-01 | -0.384 |
| 2015-09-02 | -0.377 |
| 2015-09-03 | -0.362 |
| 2015-09-04 | -0.359 |
| 2015-09-07 | -0.35 |
| 2015-09-08 | -0.341 |
| 2015-09-09 | -0.345 |
| 2015-09-10 | -0.329 |
| 2015-09-11 | -0.327 |
| 2015-09-14 | -0.328 |
| 2015-09-15 | -0.324 |
| 2015-09-16 | -0.312 |
| 2015-09-17 | -0.317 |
| 2015-09-18 | -0.333 |
| 2015-09-21 | -0.343 |
| 2015-09-22 | -0.353 |
| 2015-09-23 | -0.339 |
| 2015-09-24 | -0.325 |
| 2015-09-25 | -0.321 |
| 2015-09-28 | -0.333 |
| 2015-09-29 | -0.334 |
| 2015-09-30 | -0.312 |
| 2015-10-01 | -0.301 |
| 2015-10-02 | -0.291 |
| 2015-10-05 | -0.29 |
| 2015-10-06 | -0.285 |
| 2015-10-07 | -0.262 |
| 2015-10-08 | -0.249 |
| 2015-10-09 | -0.248 |
| 2015-10-13 | -0.229 |
| 2015-10-14 | -0.234 |
| 2015-10-15 | -0.234 |
| 2015-10-16 | -0.248 |
| 2015-10-19 | -0.26 |
| 2015-10-20 | -0.261 |
| 2015-10-21 | -0.267 |
| 2015-10-22 | -0.256 |
| 2015-10-23 | -0.263 |
| 2015-10-26 | -0.263 |
| 2015-10-27 | -0.262 |
| 2015-10-28 | -0.27 |
| 2015-10-29 | -0.281 |
| 2015-10-30 | -0.289 |
| 2015-11-03 | -0.294 |
| 2015-11-04 | -0.288 |
| 2015-11-05 | -0.287 |
| 2015-11-06 | -0.294 |
| 2015-11-09 | -0.297 |
| 2015-11-10 | -0.299 |
| 2015-11-11 | -0.297 |
| 2015-11-12 | -0.317 |
| 2015-11-13 | -0.332 |
| 2015-11-17 | -0.366 |
| 2015-11-18 | -0.347 |
| 2015-11-19 | -0.351 |
| 2015-11-20 | -0.334 |
| 2015-11-23 | -0.338 |
| 2015-11-24 | -0.343 |
| 2015-11-25 | -0.35 |
| 2015-11-26 | -0.34 |
| 2015-11-27 | -0.338 |
| 2015-11-30 | -0.314 |
| 2015-12-01 | -0.308 |
| 2015-12-02 | -0.316 |
| 2015-12-03 | -0.338 |
| 2015-12-04 | -0.334 |
| 2015-12-07 | -0.356 |
| 2015-12-09 | -0.338 |
| 2015-12-10 | -0.29 |
| 2015-12-11 | -0.272 |
| 2015-12-14 | -0.252 |
| 2015-12-15 | -0.202 |
| 2015-12-16 | -0.195 |
| 2015-12-17 | -0.225 |
| 2015-12-18 | -0.229 |
| 2015-12-21 | -0.257 |
| 2015-12-22 | -0.301 |
| 2015-12-23 | -0.281 |
| 2015-12-24 | -0.287 |
| 2015-12-28 | -0.275 |
| 2015-12-29 | -0.272 |
| 2015-12-30 | -0.271 |
| 2016-01-04 | -0.273 |
| 2016-01-05 | -0.217 |
| 2016-01-06 | -0.229 |
| 2016-01-07 | -0.252 |
| 2016-01-08 | -0.266 |
| 2016-01-12 | -0.279 |
| 2016-01-13 | -0.253 |
| 2016-01-14 | -0.207 |
| 2016-01-15 | -0.224 |
| 2016-01-18 | -0.244 |
| 2016-01-19 | -0.224 |
| 2016-01-20 | -0.216 |
| 2016-01-21 | -0.21 |
| 2016-01-22 | -0.204 |
| 2016-01-25 | -0.223 |
| 2016-01-26 | -0.219 |
| 2016-01-27 | -0.211 |
| 2016-01-28 | -0.189 |
| 2016-01-29 | -0.181 |
| 2016-02-01 | -0.162 |
| 2016-02-02 | -0.189 |
| 2016-02-03 | -0.196 |
| 2016-02-04 | -0.184 |
| 2016-02-05 | -0.183 |
| 2016-02-08 | -0.186 |
| 2016-02-09 | -0.175 |
| 2016-02-10 | -0.156 |
| 2016-02-11 | -0.142 |
| 2016-02-12 | -0.133 |
| 2016-02-15 | -0.144 |
| 2016-02-16 | -0.153 |
| 2016-02-17 | -0.125 |
| 2016-02-18 | -0.123 |
| 2016-02-19 | -0.116 |
| 2016-02-22 | -0.102 |
| 2016-02-23 | -0.112 |
| 2016-02-24 | -0.106 |
| 2016-02-25 | -0.094 |
| 2016-02-26 | -0.088 |